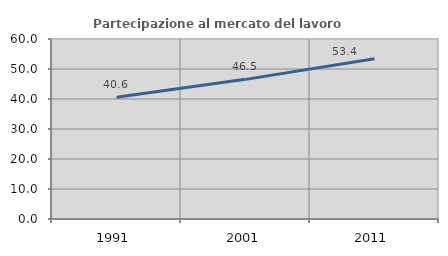
| Category | Partecipazione al mercato del lavoro  femminile |
|---|---|
| 1991.0 | 40.614 |
| 2001.0 | 46.548 |
| 2011.0 | 53.445 |